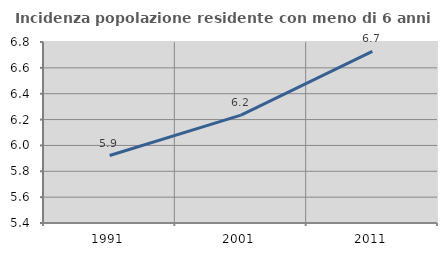
| Category | Incidenza popolazione residente con meno di 6 anni |
|---|---|
| 1991.0 | 5.922 |
| 2001.0 | 6.235 |
| 2011.0 | 6.727 |